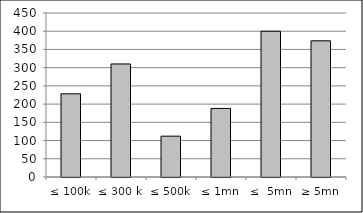
| Category | Series 0 |
|---|---|
| ≤ 100k | 228237281.042 |
| ≤ 300 k | 310164189.665 |
| ≤ 500k | 112061453.265 |
| ≤ 1mn | 188117311.881 |
| ≤  5mn | 399931063.115 |
| ≥ 5mn | 373664906.56 |